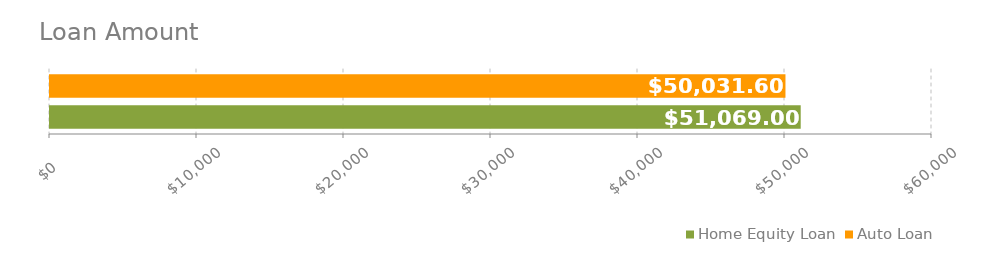
| Category | Home Equity Loan | Auto Loan |
|---|---|---|
| Loan total | 51069 | 50031.6 |